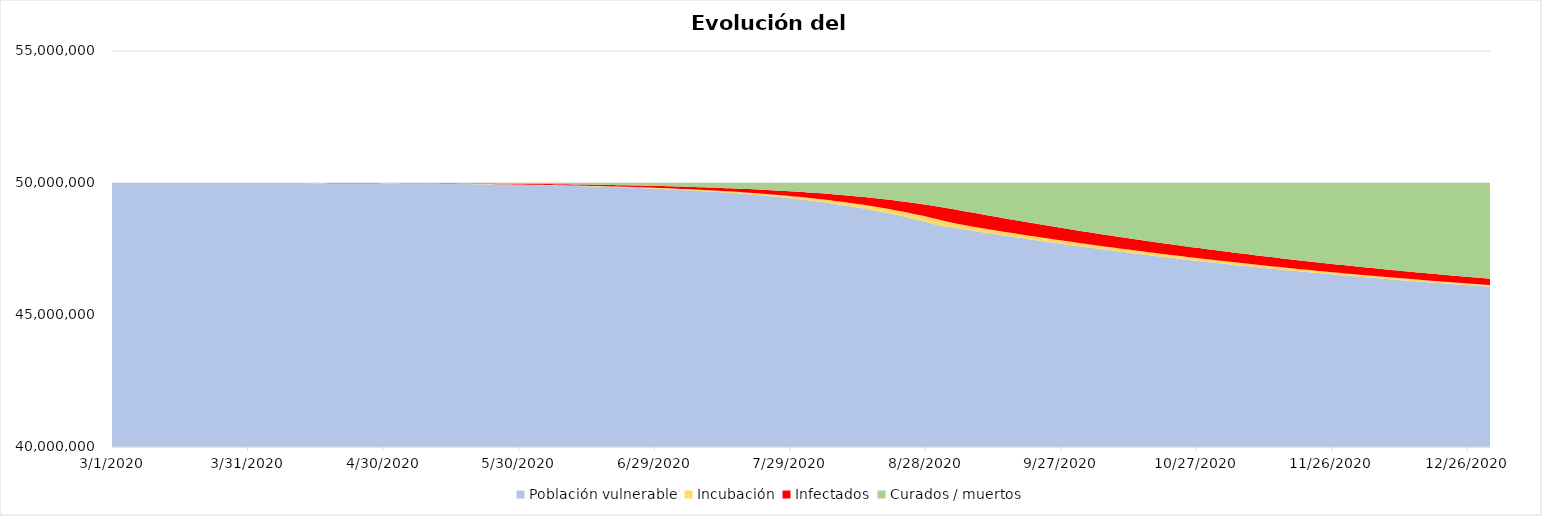
| Category |  Población vulnerable  | Incubación | Infectados | Curados / muertos |
|---|---|---|---|---|
| 3/1/20 | 49999895 | 100 | 5 | 0 |
| 3/2/20 | 49999893.835 | 81.935 | 23.939 | 0.291 |
| 3/3/20 | 49999888.254 | 71.758 | 38.301 | 1.686 |
| 3/4/20 | 49999879.326 | 66.887 | 49.869 | 3.918 |
| 3/5/20 | 49999867.702 | 65.648 | 59.825 | 6.825 |
| 3/6/20 | 49999853.757 | 66.969 | 68.964 | 10.311 |
| 3/7/20 | 49999837.681 | 70.166 | 77.823 | 14.33 |
| 3/8/20 | 49999819.541 | 74.813 | 86.782 | 18.865 |
| 3/9/20 | 49999799.312 | 80.654 | 96.112 | 23.922 |
| 3/10/20 | 49999776.908 | 87.548 | 106.021 | 29.523 |
| 3/11/20 | 49999752.195 | 95.425 | 116.679 | 35.701 |
| 3/12/20 | 49999724.997 | 104.272 | 128.23 | 42.501 |
| 3/13/20 | 49999695.107 | 114.11 | 140.81 | 49.973 |
| 3/14/20 | 49999662.284 | 124.988 | 154.548 | 58.179 |
| 3/15/20 | 49999626.259 | 136.977 | 169.578 | 67.186 |
| 3/16/20 | 49999586.731 | 150.164 | 186.038 | 77.068 |
| 3/17/20 | 49999543.366 | 164.651 | 204.074 | 87.909 |
| 3/18/20 | 49999495.796 | 180.557 | 223.845 | 99.801 |
| 3/19/20 | 49999443.618 | 198.012 | 245.523 | 112.846 |
| 3/20/20 | 49999386.388 | 217.164 | 269.295 | 127.154 |
| 3/21/20 | 49999323.616 | 238.173 | 295.364 | 142.847 |
| 3/22/20 | 49999254.767 | 261.219 | 323.954 | 160.059 |
| 3/23/20 | 49999179.255 | 286.497 | 355.31 | 178.938 |
| 3/24/20 | 49999096.433 | 314.223 | 389.7 | 199.644 |
| 3/25/20 | 49999005.596 | 344.633 | 427.418 | 222.353 |
| 3/26/20 | 49998905.967 | 377.987 | 468.786 | 247.261 |
| 3/27/20 | 49998796.695 | 414.569 | 514.157 | 274.58 |
| 3/28/20 | 49998676.848 | 454.691 | 563.919 | 304.542 |
| 3/29/20 | 49998545.402 | 498.697 | 618.497 | 337.405 |
| 3/30/20 | 49998401.234 | 546.961 | 678.357 | 373.448 |
| 3/31/20 | 49998243.114 | 599.896 | 744.011 | 412.979 |
| 4/1/20 | 49998108.711 | 618.935 | 816.018 | 456.336 |
| 4/2/20 | 49997961.3 | 647.319 | 887.491 | 503.89 |
| 4/3/20 | 49997800.979 | 683.156 | 960.257 | 555.608 |
| 4/4/20 | 49997627.514 | 725.245 | 1035.674 | 611.567 |
| 4/5/20 | 49997440.426 | 772.863 | 1114.79 | 671.921 |
| 4/6/20 | 49997239.046 | 825.615 | 1198.453 | 736.886 |
| 4/7/20 | 49997022.555 | 883.335 | 1287.385 | 806.726 |
| 4/8/20 | 49996789.999 | 946.018 | 1382.235 | 881.748 |
| 4/9/20 | 49996540.31 | 1013.78 | 1483.612 | 962.298 |
| 4/10/20 | 49996272.311 | 1086.822 | 1592.112 | 1048.755 |
| 4/11/20 | 49995984.713 | 1165.416 | 1708.336 | 1141.536 |
| 4/12/20 | 49995676.122 | 1249.888 | 1832.901 | 1241.089 |
| 4/13/20 | 49995345.032 | 1340.615 | 1966.451 | 1347.902 |
| 4/14/20 | 49994989.821 | 1438.016 | 2109.667 | 1462.497 |
| 4/15/20 | 49994608.742 | 1542.553 | 2263.267 | 1585.438 |
| 4/16/20 | 49994199.921 | 1654.73 | 2428.02 | 1717.33 |
| 4/17/20 | 49993761.343 | 1775.09 | 2604.744 | 1858.823 |
| 4/18/20 | 49993290.848 | 1904.222 | 2794.316 | 2010.614 |
| 4/19/20 | 49992786.115 | 2042.758 | 2997.674 | 2173.453 |
| 4/20/20 | 49992244.655 | 2191.38 | 3215.822 | 2348.143 |
| 4/21/20 | 49991663.798 | 2350.817 | 3449.839 | 2535.545 |
| 4/22/20 | 49991040.68 | 2521.856 | 3700.88 | 2736.585 |
| 4/23/20 | 49990372.225 | 2705.338 | 3970.183 | 2952.254 |
| 4/24/20 | 49989655.139 | 2902.167 | 4259.078 | 3183.616 |
| 4/25/20 | 49988885.885 | 3113.312 | 4568.989 | 3431.814 |
| 4/26/20 | 49988060.668 | 3339.815 | 4901.445 | 3698.072 |
| 4/27/20 | 49987175.42 | 3582.79 | 5258.085 | 3983.704 |
| 4/28/20 | 49986225.777 | 3843.436 | 5640.668 | 4290.12 |
| 4/29/20 | 49985207.056 | 4123.035 | 6051.08 | 4618.83 |
| 4/30/20 | 49984114.236 | 4422.964 | 6491.344 | 4971.457 |
| 5/1/20 | 49983282.276 | 4404.353 | 6963.63 | 5349.74 |
| 5/2/20 | 49982389.802 | 4449.837 | 7404.815 | 5755.546 |
| 5/3/20 | 49981440.801 | 4543.1 | 7829.037 | 6187.062 |
| 5/4/20 | 49980437.451 | 4672.777 | 8246.473 | 6643.3 |
| 5/5/20 | 49979380.624 | 4830.992 | 8664.52 | 7123.864 |
| 5/6/20 | 49978270.247 | 5012.333 | 9088.631 | 7628.789 |
| 5/7/20 | 49977105.544 | 5213.126 | 9522.901 | 8158.429 |
| 5/8/20 | 49975885.218 | 5430.927 | 9970.478 | 8713.377 |
| 5/9/20 | 49974607.568 | 5664.168 | 10433.857 | 9294.407 |
| 5/10/20 | 49973270.574 | 5911.9 | 10915.086 | 9902.441 |
| 5/11/20 | 49971871.952 | 6173.618 | 11415.913 | 10538.518 |
| 5/12/20 | 49970409.197 | 6449.139 | 11937.884 | 11203.781 |
| 5/13/20 | 49968879.604 | 6738.512 | 12482.422 | 11899.462 |
| 5/14/20 | 49967280.29 | 7041.959 | 13050.876 | 12626.876 |
| 5/15/20 | 49965608.196 | 7359.83 | 13644.558 | 13387.416 |
| 5/16/20 | 49963860.097 | 7692.577 | 14264.772 | 14182.554 |
| 5/17/20 | 49962032.602 | 8040.731 | 14912.834 | 15013.834 |
| 5/18/20 | 49960122.152 | 8404.886 | 15590.082 | 15882.88 |
| 5/19/20 | 49958125.017 | 8785.696 | 16297.893 | 16791.393 |
| 5/20/20 | 49956037.294 | 9183.863 | 17037.689 | 17741.154 |
| 5/21/20 | 49953854.895 | 9600.134 | 17810.945 | 18734.026 |
| 5/22/20 | 49951573.548 | 10035.301 | 18619.19 | 19771.96 |
| 5/23/20 | 49949188.784 | 10490.199 | 19464.022 | 20856.995 |
| 5/24/20 | 49946695.933 | 10965.705 | 20347.101 | 21991.262 |
| 5/25/20 | 49944090.111 | 11462.737 | 21270.162 | 23176.99 |
| 5/26/20 | 49941366.217 | 11982.259 | 22235.014 | 24416.51 |
| 5/27/20 | 49938518.917 | 12525.279 | 23243.548 | 25712.257 |
| 5/28/20 | 49935542.639 | 13092.849 | 24297.736 | 27066.776 |
| 5/29/20 | 49932431.56 | 13686.072 | 25399.64 | 28482.728 |
| 5/30/20 | 49929179.597 | 14306.099 | 26551.411 | 29962.893 |
| 5/31/20 | 49925780.391 | 14954.131 | 27755.299 | 31510.178 |
| 6/1/20 | 49922873.318 | 14985.41 | 29013.652 | 33127.62 |
| 6/2/20 | 49919834.622 | 15142.296 | 30204.689 | 34818.392 |
| 6/3/20 | 49916671.378 | 15393.56 | 31356.489 | 36578.572 |
| 6/4/20 | 49913387.717 | 15716.921 | 32489.488 | 38405.874 |
| 6/5/20 | 49909985.632 | 16096.521 | 33618.646 | 40299.2 |
| 6/6/20 | 49906465.55 | 16521.119 | 34755.002 | 42258.329 |
| 6/7/20 | 49902826.74 | 16982.79 | 35906.791 | 44283.679 |
| 6/8/20 | 49899067.613 | 17475.996 | 37080.242 | 46376.149 |
| 6/9/20 | 49895185.929 | 17996.912 | 38280.157 | 48537.002 |
| 6/10/20 | 49891178.945 | 18542.951 | 39510.323 | 50767.781 |
| 6/11/20 | 49887043.526 | 19112.418 | 40773.809 | 53070.247 |
| 6/12/20 | 49882776.215 | 19704.264 | 42073.178 | 55446.343 |
| 6/13/20 | 49878373.292 | 20317.906 | 43410.642 | 57898.16 |
| 6/14/20 | 49873830.804 | 20953.104 | 44788.174 | 60427.918 |
| 6/15/20 | 49869144.599 | 21609.866 | 46207.584 | 63037.951 |
| 6/16/20 | 49864310.335 | 22288.387 | 47670.578 | 65730.701 |
| 6/17/20 | 49859323.495 | 22988.999 | 49178.8 | 68508.707 |
| 6/18/20 | 49854179.393 | 23712.139 | 50733.864 | 71374.604 |
| 6/19/20 | 49848873.18 | 24458.326 | 52337.372 | 74331.123 |
| 6/20/20 | 49843399.839 | 25228.142 | 53990.933 | 77381.086 |
| 6/21/20 | 49837754.192 | 26022.223 | 55696.174 | 80527.411 |
| 6/22/20 | 49831930.894 | 26841.248 | 57454.75 | 83773.109 |
| 6/23/20 | 49825924.43 | 27685.933 | 59268.349 | 87121.288 |
| 6/24/20 | 49819729.115 | 28557.031 | 61138.701 | 90575.154 |
| 6/25/20 | 49813339.086 | 29455.322 | 63067.576 | 94138.016 |
| 6/26/20 | 49806748.303 | 30381.62 | 65056.794 | 97813.282 |
| 6/27/20 | 49799950.54 | 31336.765 | 67108.225 | 101604.471 |
| 6/28/20 | 49792939.38 | 32321.624 | 69223.79 | 105515.206 |
| 6/29/20 | 49785708.213 | 33337.093 | 71405.467 | 109549.227 |
| 6/30/20 | 49778250.231 | 34384.096 | 73655.288 | 113710.385 |
| 7/1/20 | 49770558.417 | 35463.584 | 75975.348 | 118002.651 |
| 7/2/20 | 49762625.545 | 36576.536 | 78367.801 | 122430.119 |
| 7/3/20 | 49754444.172 | 37723.959 | 80834.862 | 126997.007 |
| 7/4/20 | 49746006.633 | 38906.891 | 83378.813 | 131707.663 |
| 7/5/20 | 49737305.033 | 40126.397 | 86002.002 | 136566.568 |
| 7/6/20 | 49728331.24 | 41383.575 | 88706.845 | 141578.34 |
| 7/7/20 | 49719076.883 | 42679.552 | 91495.828 | 146747.736 |
| 7/8/20 | 49709533.342 | 44015.487 | 94371.51 | 152079.661 |
| 7/9/20 | 49699691.74 | 45392.573 | 97336.521 | 157579.166 |
| 7/10/20 | 49689542.939 | 46812.033 | 100393.571 | 163251.458 |
| 7/11/20 | 49679077.532 | 48275.126 | 103545.444 | 169101.899 |
| 7/12/20 | 49668285.835 | 49783.144 | 106795.005 | 175136.016 |
| 7/13/20 | 49657157.881 | 51337.417 | 110145.201 | 181359.501 |
| 7/14/20 | 49645683.41 | 52939.307 | 113599.063 | 187778.219 |
| 7/15/20 | 49633851.865 | 54590.216 | 117159.707 | 194398.211 |
| 7/16/20 | 49621652.381 | 56291.582 | 120830.337 | 201225.7 |
| 7/17/20 | 49609073.777 | 58044.881 | 124614.247 | 208267.095 |
| 7/18/20 | 49596104.552 | 59851.629 | 128514.821 | 215528.997 |
| 7/19/20 | 49582732.871 | 61713.381 | 132535.541 | 223018.206 |
| 7/20/20 | 49568946.562 | 63631.733 | 136679.983 | 230741.722 |
| 7/21/20 | 49554733.101 | 65608.322 | 140951.821 | 238706.756 |
| 7/22/20 | 49540079.612 | 67644.826 | 145354.83 | 246920.732 |
| 7/23/20 | 49524972.85 | 69742.968 | 149892.889 | 255391.293 |
| 7/24/20 | 49509399.197 | 71904.511 | 154569.982 | 264126.31 |
| 7/25/20 | 49493344.651 | 74131.267 | 159390.198 | 273133.885 |
| 7/26/20 | 49476794.817 | 76425.087 | 164357.737 | 282422.358 |
| 7/27/20 | 49459734.9 | 78787.873 | 169476.913 | 292000.314 |
| 7/28/20 | 49442149.69 | 81221.568 | 174752.15 | 301876.591 |
| 7/29/20 | 49424023.56 | 83728.166 | 180187.991 | 312060.283 |
| 7/30/20 | 49405340.451 | 86309.705 | 185789.095 | 322560.749 |
| 7/31/20 | 49386083.863 | 88968.273 | 191560.245 | 333387.619 |
| 8/1/20 | 49366236.849 | 91706.004 | 197506.344 | 344550.803 |
| 8/2/20 | 49345781.999 | 94525.084 | 203632.42 | 356060.497 |
| 8/3/20 | 49324701.437 | 97427.744 | 209943.63 | 367927.188 |
| 8/4/20 | 49302976.808 | 100416.27 | 216445.257 | 380161.666 |
| 8/5/20 | 49280589.265 | 103492.991 | 223142.718 | 392775.026 |
| 8/6/20 | 49257519.465 | 106660.293 | 230041.562 | 405778.68 |
| 8/7/20 | 49233747.556 | 109920.607 | 237147.471 | 419184.366 |
| 8/8/20 | 49209253.167 | 113276.418 | 244466.267 | 433004.149 |
| 8/9/20 | 49184015.399 | 116730.259 | 252003.907 | 447250.435 |
| 8/10/20 | 49158012.817 | 120284.714 | 259766.492 | 461935.977 |
| 8/11/20 | 49131223.437 | 123942.418 | 267760.26 | 477073.884 |
| 8/12/20 | 49103624.719 | 127706.056 | 275991.596 | 492677.629 |
| 8/13/20 | 49075193.556 | 131578.363 | 284467.026 | 508761.055 |
| 8/14/20 | 49045906.267 | 135562.12 | 293193.225 | 525338.388 |
| 8/15/20 | 49015738.587 | 139660.162 | 302177.011 | 542424.24 |
| 8/16/20 | 48984665.658 | 143875.367 | 311425.352 | 560033.623 |
| 8/17/20 | 48952662.022 | 148210.664 | 320945.361 | 578181.954 |
| 8/18/20 | 48919701.609 | 152669.025 | 330744.302 | 596885.063 |
| 8/19/20 | 48885757.737 | 157253.47 | 340829.587 | 616159.207 |
| 8/20/20 | 48850803.095 | 161967.06 | 351208.774 | 636021.071 |
| 8/21/20 | 48814809.744 | 166812.899 | 361889.574 | 656487.783 |
| 8/22/20 | 48777749.106 | 171794.133 | 372879.842 | 677576.919 |
| 8/23/20 | 48739591.961 | 176913.946 | 384187.581 | 699306.513 |
| 8/24/20 | 48700308.438 | 182175.556 | 395820.94 | 721695.067 |
| 8/25/20 | 48659868.014 | 187582.219 | 407788.212 | 744761.555 |
| 8/26/20 | 48618239.51 | 193137.22 | 420097.834 | 768525.437 |
| 8/27/20 | 48575391.082 | 198843.874 | 432758.381 | 793006.663 |
| 8/28/20 | 48531290.227 | 204705.523 | 445778.568 | 818225.683 |
| 8/29/20 | 48485903.774 | 210725.529 | 459167.242 | 844203.455 |
| 8/30/20 | 48439197.889 | 216907.274 | 472933.385 | 870961.452 |
| 8/31/20 | 48391138.07 | 223254.156 | 487086.101 | 898521.673 |
| 9/1/20 | 48366413.611 | 205045.123 | 501634.622 | 926906.644 |
| 9/2/20 | 48340963.68 | 191063.3 | 511833.59 | 956139.431 |
| 9/3/20 | 48315009.978 | 180274.059 | 518749.4 | 985966.563 |
| 9/4/20 | 48288719.717 | 171896.232 | 523187.336 | 1016196.715 |
| 9/5/20 | 48262218.969 | 165340.013 | 525755.532 | 1046685.487 |
| 9/6/20 | 48235602.75 | 160160.075 | 526913.254 | 1077323.921 |
| 9/7/20 | 48208942.633 | 156020.178 | 527007.368 | 1108029.822 |
| 9/8/20 | 48182292.491 | 152666.439 | 526299.863 | 1138741.207 |
| 9/9/20 | 48155692.84 | 149907.159 | 524988.638 | 1169411.362 |
| 9/10/20 | 48129174.108 | 147597.592 | 523223.195 | 1200005.106 |
| 9/11/20 | 48102759.108 | 145628.44 | 521116.485 | 1230495.968 |
| 9/12/20 | 48076464.904 | 143917.174 | 518753.86 | 1260864.061 |
| 9/13/20 | 48050304.22 | 142401.478 | 516199.829 | 1291094.473 |
| 9/14/20 | 48024286.501 | 141034.298 | 513503.153 | 1321176.048 |
| 9/15/20 | 47998418.716 | 139780.103 | 510700.707 | 1351100.474 |
| 9/16/20 | 47972705.961 | 138612.069 | 507820.383 | 1380861.587 |
| 9/17/20 | 47947151.921 | 137509.942 | 504883.288 | 1410454.85 |
| 9/18/20 | 47921759.212 | 136458.431 | 501905.404 | 1439876.953 |
| 9/19/20 | 47896529.642 | 135445.995 | 498898.843 | 1469125.52 |
| 9/20/20 | 47871464.408 | 134463.922 | 495872.791 | 1498198.879 |
| 9/21/20 | 47846564.244 | 133505.64 | 492834.222 | 1527095.895 |
| 9/22/20 | 47821829.533 | 132566.189 | 489788.44 | 1555815.838 |
| 9/23/20 | 47797260.394 | 131641.83 | 486739.488 | 1584358.287 |
| 9/24/20 | 47772856.743 | 130729.745 | 483690.453 | 1612723.059 |
| 9/25/20 | 47748618.343 | 129827.809 | 480643.699 | 1640910.149 |
| 9/26/20 | 47724544.84 | 128934.426 | 477601.046 | 1668919.688 |
| 9/27/20 | 47700635.792 | 128048.392 | 474563.899 | 1696751.917 |
| 9/28/20 | 47676890.687 | 127168.806 | 471533.351 | 1724407.156 |
| 9/29/20 | 47653308.963 | 126294.991 | 468510.257 | 1751885.79 |
| 9/30/20 | 47629890.014 | 125426.441 | 465495.293 | 1779188.252 |
| 10/1/20 | 47606633.207 | 124562.779 | 462488.997 | 1806315.017 |
| 10/2/20 | 47583537.881 | 123703.724 | 459491.804 | 1833266.591 |
| 10/3/20 | 47560603.358 | 122849.07 | 456504.07 | 1860043.502 |
| 10/4/20 | 47537828.943 | 121998.664 | 453526.09 | 1886646.304 |
| 10/5/20 | 47515213.93 | 121152.395 | 450558.112 | 1913075.563 |
| 10/6/20 | 47492757.603 | 120310.185 | 447600.349 | 1939331.863 |
| 10/7/20 | 47470459.238 | 119471.976 | 444652.987 | 1965415.8 |
| 10/8/20 | 47448318.103 | 118637.73 | 441716.188 | 1991327.978 |
| 10/9/20 | 47426333.463 | 117807.422 | 438790.1 | 2017069.015 |
| 10/10/20 | 47404504.576 | 116981.036 | 435874.855 | 2042639.534 |
| 10/11/20 | 47382830.697 | 116158.562 | 432970.575 | 2068040.166 |
| 10/12/20 | 47361311.076 | 115339.997 | 430077.375 | 2093271.552 |
| 10/13/20 | 47339944.963 | 114525.342 | 427195.359 | 2118334.336 |
| 10/14/20 | 47318731.601 | 113714.6 | 424324.629 | 2143229.17 |
| 10/15/20 | 47297670.234 | 112907.774 | 421465.279 | 2167956.713 |
| 10/16/20 | 47276760.102 | 112104.873 | 418617.399 | 2192517.626 |
| 10/17/20 | 47256000.444 | 111305.902 | 415781.075 | 2216912.58 |
| 10/18/20 | 47235390.496 | 110510.869 | 412956.39 | 2241142.246 |
| 10/19/20 | 47214929.492 | 109719.782 | 410143.422 | 2265207.304 |
| 10/20/20 | 47194616.668 | 108932.648 | 407342.248 | 2289108.435 |
| 10/21/20 | 47174451.254 | 108149.476 | 404552.941 | 2312846.329 |
| 10/22/20 | 47154432.482 | 107370.272 | 401775.571 | 2336421.675 |
| 10/23/20 | 47134559.58 | 106595.044 | 399010.206 | 2359835.17 |
| 10/24/20 | 47114831.779 | 105823.798 | 396256.91 | 2383087.513 |
| 10/25/20 | 47095248.306 | 105056.541 | 393515.746 | 2406179.407 |
| 10/26/20 | 47075808.388 | 104293.278 | 390786.773 | 2429111.56 |
| 10/27/20 | 47056511.252 | 103534.015 | 388070.051 | 2451884.682 |
| 10/28/20 | 47037356.123 | 102778.756 | 385365.634 | 2474499.487 |
| 10/29/20 | 47018342.228 | 102027.506 | 382673.574 | 2496956.692 |
| 10/30/20 | 46999468.79 | 101280.269 | 379993.924 | 2519257.017 |
| 10/31/20 | 46980735.036 | 100537.049 | 377326.731 | 2541401.185 |
| 11/1/20 | 46962140.189 | 99797.848 | 374672.041 | 2563389.922 |
| 11/2/20 | 46943683.475 | 99062.668 | 372029.9 | 2585223.957 |
| 11/3/20 | 46925364.118 | 98331.512 | 369400.349 | 2606904.021 |
| 11/4/20 | 46907181.342 | 97604.381 | 366783.428 | 2628430.848 |
| 11/5/20 | 46889134.374 | 96881.277 | 364179.176 | 2649805.174 |
| 11/6/20 | 46871222.437 | 96162.199 | 361587.628 | 2671027.736 |
| 11/7/20 | 46853444.758 | 95447.147 | 359008.818 | 2692099.276 |
| 11/8/20 | 46835800.562 | 94736.122 | 356442.779 | 2713020.536 |
| 11/9/20 | 46818289.077 | 94029.123 | 353889.541 | 2733792.26 |
| 11/10/20 | 46800909.528 | 93326.148 | 351349.131 | 2754415.194 |
| 11/11/20 | 46783661.145 | 92627.195 | 348821.576 | 2774890.085 |
| 11/12/20 | 46766543.155 | 91932.263 | 346306.9 | 2795217.682 |
| 11/13/20 | 46749554.788 | 91241.349 | 343805.127 | 2815398.737 |
| 11/14/20 | 46732695.274 | 90554.449 | 341316.276 | 2835434.001 |
| 11/15/20 | 46715963.844 | 89871.562 | 338840.367 | 2855324.227 |
| 11/16/20 | 46699359.731 | 89192.682 | 336377.418 | 2875070.169 |
| 11/17/20 | 46682882.168 | 88517.806 | 333927.443 | 2894672.583 |
| 11/18/20 | 46666530.39 | 87846.93 | 331490.457 | 2914132.224 |
| 11/19/20 | 46650303.632 | 87180.047 | 329066.471 | 2933449.849 |
| 11/20/20 | 46634201.131 | 86517.155 | 326655.497 | 2952626.217 |
| 11/21/20 | 46618222.126 | 85858.245 | 324257.544 | 2971662.085 |
| 11/22/20 | 46602365.856 | 85203.314 | 321872.617 | 2990558.213 |
| 11/23/20 | 46586631.564 | 84552.354 | 319500.725 | 3009315.358 |
| 11/24/20 | 46571018.491 | 83905.358 | 317141.869 | 3027934.281 |
| 11/25/20 | 46555525.883 | 83262.321 | 314796.054 | 3046415.742 |
| 11/26/20 | 46540152.985 | 82623.234 | 312463.28 | 3064760.501 |
| 11/27/20 | 46524899.046 | 81988.09 | 310143.548 | 3082969.317 |
| 11/28/20 | 46509763.314 | 81356.881 | 307836.855 | 3101042.95 |
| 11/29/20 | 46494745.043 | 80729.599 | 305543.198 | 3118982.161 |
| 11/30/20 | 46479843.483 | 80106.235 | 303262.573 | 3136787.708 |
| 12/1/20 | 46465057.892 | 79486.781 | 300994.974 | 3154460.352 |
| 12/2/20 | 46450387.526 | 78871.228 | 298740.394 | 3172000.852 |
| 12/3/20 | 46435831.645 | 78259.565 | 296498.824 | 3189409.966 |
| 12/4/20 | 46421389.509 | 77651.785 | 294270.254 | 3206688.452 |
| 12/5/20 | 46407060.382 | 77047.876 | 292054.674 | 3223837.068 |
| 12/6/20 | 46392843.53 | 76447.829 | 289852.07 | 3240856.572 |
| 12/7/20 | 46378738.221 | 75851.633 | 287662.429 | 3257747.718 |
| 12/8/20 | 46364743.724 | 75259.277 | 285485.736 | 3274511.263 |
| 12/9/20 | 46350859.311 | 74670.752 | 283321.976 | 3291147.961 |
| 12/10/20 | 46337084.259 | 74086.044 | 281171.132 | 3307658.565 |
| 12/11/20 | 46323417.842 | 73505.145 | 279033.184 | 3324043.829 |
| 12/12/20 | 46309859.341 | 72928.041 | 276908.114 | 3340304.504 |
| 12/13/20 | 46296408.038 | 72354.721 | 274795.9 | 3356441.341 |
| 12/14/20 | 46283063.216 | 71785.173 | 272696.523 | 3372455.088 |
| 12/15/20 | 46269824.164 | 71219.385 | 270609.958 | 3388346.494 |
| 12/16/20 | 46256690.169 | 70657.344 | 268536.182 | 3404116.305 |
| 12/17/20 | 46243660.524 | 70099.039 | 266475.171 | 3419765.266 |
| 12/18/20 | 46230734.523 | 69544.455 | 264426.9 | 3435294.123 |
| 12/19/20 | 46217911.464 | 68993.581 | 262391.34 | 3450703.616 |
| 12/20/20 | 46205190.646 | 68446.402 | 260368.466 | 3465994.486 |
| 12/21/20 | 46192571.372 | 67902.907 | 258358.248 | 3481167.474 |
| 12/22/20 | 46180052.947 | 67363.08 | 256360.657 | 3496223.316 |
| 12/23/20 | 46167634.679 | 66826.91 | 254375.664 | 3511162.748 |
| 12/24/20 | 46155315.879 | 66294.381 | 252403.236 | 3525986.505 |
| 12/25/20 | 46143095.86 | 65765.48 | 250443.342 | 3540695.318 |
| 12/26/20 | 46130973.939 | 65240.193 | 248495.949 | 3555289.918 |
| 12/27/20 | 46118949.436 | 64718.506 | 246561.024 | 3569771.034 |
| 12/28/20 | 46107021.671 | 64200.404 | 244638.533 | 3584139.392 |
| 12/29/20 | 46095189.971 | 63685.872 | 242728.44 | 3598395.717 |
| 12/30/20 | 46083453.663 | 63174.897 | 240830.709 | 3612540.731 |
| 12/31/20 | 46071812.078 | 62667.463 | 238945.304 | 3626575.154 |